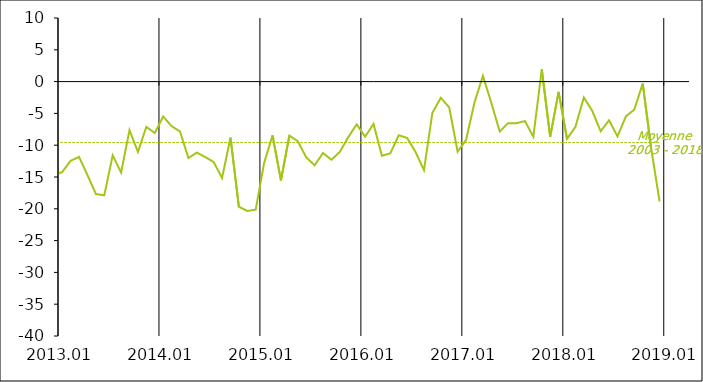
| Category | Series 1 | Moyenne
2003 - 2018 |
|---|---|---|
| 2003-01-20 | 0 | -9.581 |
| 2003-02-20 | -6 | -9.581 |
| 2003-03-20 | -10 | -9.581 |
| 2003-04-20 | 0 | -9.581 |
| 2003-05-20 | -2 | -9.581 |
| 2003-06-20 | -1 | -9.581 |
| 2003-07-20 | -4 | -9.581 |
| 2003-08-20 | 0 | -9.581 |
| 2003-09-20 | -2 | -9.581 |
| 2003-10-20 | -3 | -9.581 |
| 2003-11-20 | 2 | -9.581 |
| 2003-12-20 | -3 | -9.581 |
| 2004-01-20 | -7 | -9.581 |
| 2004-02-20 | -3 | -9.581 |
| 2004-03-20 | 1 | -9.581 |
| 2004-04-20 | -4 | -9.581 |
| 2004-05-20 | -1 | -9.581 |
| 2004-06-20 | -2 | -9.581 |
| 2004-07-20 | -5 | -9.581 |
| 2004-08-20 | 3 | -9.581 |
| 2004-09-20 | -3 | -9.581 |
| 2004-10-20 | 1 | -9.581 |
| 2004-11-20 | -6 | -9.581 |
| 2004-12-20 | -4 | -9.581 |
| 2005-01-20 | -3 | -9.581 |
| 2005-02-20 | 5 | -9.581 |
| 2005-03-20 | -5 | -9.581 |
| 2005-04-20 | -7 | -9.581 |
| 2005-05-20 | -8 | -9.581 |
| 2005-06-20 | -8 | -9.581 |
| 2005-07-20 | -4 | -9.581 |
| 2005-08-20 | -9 | -9.581 |
| 2005-09-20 | -7 | -9.581 |
| 2005-10-20 | -7 | -9.581 |
| 2005-11-20 | -9 | -9.581 |
| 2005-12-20 | -4 | -9.581 |
| 2006-01-20 | 1 | -9.581 |
| 2006-02-20 | -6 | -9.581 |
| 2006-03-20 | -3 | -9.581 |
| 2006-04-20 | -7 | -9.581 |
| 2006-05-20 | -9 | -9.581 |
| 2006-06-20 | -2 | -9.581 |
| 2006-07-20 | -1 | -9.581 |
| 2006-08-20 | -8 | -9.581 |
| 2006-09-20 | -13 | -9.581 |
| 2006-10-20 | -9 | -9.581 |
| 2006-11-20 | -5 | -9.581 |
| 2006-12-20 | -6 | -9.581 |
| 2007-01-20 | -7 | -9.581 |
| 2007-02-20 | -4 | -9.581 |
| 2007-03-20 | -4 | -9.581 |
| 2007-04-20 | -2 | -9.581 |
| 2007-05-20 | -3 | -9.581 |
| 2007-06-20 | -5 | -9.581 |
| 2007-07-20 | -8 | -9.581 |
| 2007-08-20 | -11 | -9.581 |
| 2007-09-20 | -4 | -9.581 |
| 2007-10-20 | -12 | -9.581 |
| 2007-11-20 | -12 | -9.581 |
| 2007-12-20 | -15 | -9.581 |
| 2008-01-20 | -20 | -9.581 |
| 2008-02-20 | -22 | -9.581 |
| 2008-03-20 | -16 | -9.581 |
| 2008-04-20 | -19 | -9.581 |
| 2008-05-20 | -16 | -9.581 |
| 2008-06-20 | -22 | -9.581 |
| 2008-07-20 | -20 | -9.581 |
| 2008-08-20 | -19 | -9.581 |
| 2008-09-20 | -15 | -9.581 |
| 2008-10-20 | -15 | -9.581 |
| 2008-11-20 | -17 | -9.581 |
| 2008-12-20 | -18 | -9.581 |
| 2009-01-20 | -17 | -9.581 |
| 2009-02-20 | -17 | -9.581 |
| 2009-03-20 | -20 | -9.581 |
| 2009-04-20 | -21 | -9.581 |
| 2009-05-20 | -22 | -9.581 |
| 2009-06-20 | -19 | -9.581 |
| 2009-07-20 | -15 | -9.581 |
| 2009-08-20 | -19 | -9.581 |
| 2009-09-20 | -14 | -9.581 |
| 2009-10-20 | -10 | -9.581 |
| 2009-11-20 | -16 | -9.581 |
| 2009-12-20 | -13 | -9.581 |
| 2010-01-20 | -8 | -9.581 |
| 2010-02-20 | -15 | -9.581 |
| 2010-03-20 | -15 | -9.581 |
| 2010-04-20 | -13 | -9.581 |
| 2010-05-20 | -14 | -9.581 |
| 2010-06-20 | -8 | -9.581 |
| 2010-07-20 | -13 | -9.581 |
| 2010-08-20 | -14 | -9.581 |
| 2010-09-20 | -12 | -9.581 |
| 2010-10-20 | -8 | -9.581 |
| 2010-11-20 | -7 | -9.581 |
| 2010-12-20 | -13 | -9.581 |
| 2011-01-20 | -15 | -9.581 |
| 2011-02-20 | -15 | -9.581 |
| 2011-03-20 | -18 | -9.581 |
| 2011-04-20 | -19 | -9.581 |
| 2011-05-20 | -13 | -9.581 |
| 2011-06-20 | -16 | -9.581 |
| 2011-07-20 | -17 | -9.581 |
| 2011-08-20 | -18 | -9.581 |
| 2011-09-20 | -8 | -9.581 |
| 2011-10-20 | -9 | -9.581 |
| 2011-11-20 | -8 | -9.581 |
| 2011-12-20 | -18 | -9.581 |
| 2012-01-20 | -16 | -9.581 |
| 2012-02-20 | -14 | -9.581 |
| 2012-03-20 | -12 | -9.581 |
| 2012-04-20 | -9 | -9.581 |
| 2012-05-20 | -8 | -9.581 |
| 2012-06-20 | -16 | -9.581 |
| 2012-07-20 | -8 | -9.581 |
| 2012-08-20 | -11 | -9.581 |
| 2012-09-20 | -11 | -9.581 |
| 2012-10-20 | -11 | -9.581 |
| 2012-11-20 | -15.069 | -9.581 |
| 2012-12-20 | -14.739 | -9.581 |
| 2013-01-20 | -14.22 | -9.581 |
| 2013-02-20 | -12.452 | -9.581 |
| 2013-03-20 | -11.836 | -9.581 |
| 2013-04-20 | -14.694 | -9.581 |
| 2013-05-20 | -17.673 | -9.581 |
| 2013-06-20 | -17.878 | -9.581 |
| 2013-07-20 | -11.597 | -9.581 |
| 2013-08-20 | -14.286 | -9.581 |
| 2013-09-20 | -7.624 | -9.581 |
| 2013-10-20 | -11.051 | -9.581 |
| 2013-11-20 | -7.118 | -9.581 |
| 2013-12-20 | -8.084 | -9.581 |
| 2014-01-20 | -5.489 | -9.581 |
| 2014-02-20 | -7.001 | -9.581 |
| 2014-03-20 | -7.84 | -9.581 |
| 2014-04-20 | -12.016 | -9.581 |
| 2014-05-20 | -11.157 | -9.581 |
| 2014-06-20 | -11.867 | -9.581 |
| 2014-07-20 | -12.639 | -9.581 |
| 2014-08-20 | -15.156 | -9.581 |
| 2014-09-20 | -8.8 | -9.581 |
| 2014-10-20 | -19.679 | -9.581 |
| 2014-11-20 | -20.338 | -9.581 |
| 2014-12-20 | -20.141 | -9.581 |
| 2015-01-20 | -12.784 | -9.581 |
| 2015-02-20 | -8.455 | -9.581 |
| 2015-03-20 | -15.527 | -9.581 |
| 2015-04-20 | -8.49 | -9.581 |
| 2015-05-20 | -9.381 | -9.581 |
| 2015-06-20 | -11.9 | -9.581 |
| 2015-07-20 | -13.16 | -9.581 |
| 2015-08-20 | -11.222 | -9.581 |
| 2015-09-20 | -12.293 | -9.581 |
| 2015-10-20 | -11.045 | -9.581 |
| 2015-11-20 | -8.736 | -9.581 |
| 2015-12-20 | -6.726 | -9.581 |
| 2016-01-20 | -8.67 | -9.581 |
| 2016-02-20 | -6.653 | -9.581 |
| 2016-03-20 | -11.663 | -9.581 |
| 2016-04-20 | -11.272 | -9.581 |
| 2016-05-20 | -8.432 | -9.581 |
| 2016-06-20 | -8.867 | -9.581 |
| 2016-07-20 | -11.078 | -9.581 |
| 2016-08-20 | -13.917 | -9.581 |
| 2016-09-20 | -4.904 | -9.581 |
| 2016-10-20 | -2.55 | -9.581 |
| 2016-11-20 | -4.062 | -9.581 |
| 2016-12-20 | -11.011 | -9.581 |
| 2017-01-20 | -9.177 | -9.581 |
| 2017-02-20 | -3.307 | -9.581 |
| 2017-03-20 | 0.905 | -9.581 |
| 2017-04-20 | -3.317 | -9.581 |
| 2017-05-20 | -7.84 | -9.581 |
| 2017-06-20 | -6.532 | -9.581 |
| 2017-07-20 | -6.538 | -9.581 |
| 2017-08-20 | -6.198 | -9.581 |
| 2017-09-20 | -8.674 | -9.581 |
| 2017-10-20 | 1.924 | -9.581 |
| 2017-11-20 | -8.669 | -9.581 |
| 2017-12-20 | -1.62 | -9.581 |
| 2018-01-20 | -8.999 | -9.581 |
| 2018-02-20 | -7.121 | -9.581 |
| 2018-03-20 | -2.491 | -9.581 |
| 2018-04-20 | -4.601 | -9.581 |
| 2018-05-20 | -7.808 | -9.581 |
| 2018-06-20 | -6.086 | -9.581 |
| 2018-07-20 | -8.618 | -9.581 |
| 2018-08-20 | -5.47 | -9.581 |
| 2018-09-20 | -4.396 | -9.581 |
| 2018-10-20 | -0.308 | -9.581 |
| 2018-11-20 | -10.44 | -9.581 |
| 2018-12-20 | -18.84 | -9.581 |